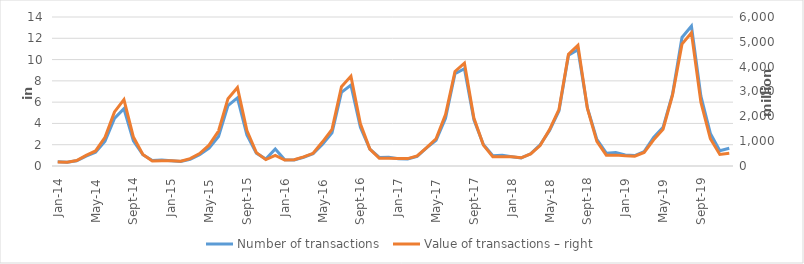
| Category | Number of transactions  |
|---|---|
| sij.14 | 397343 |
| vlj.14 | 361078 |
| ožu.14 | 493145 |
| tra.14 | 934003 |
| svi.14 | 1295388 |
| lip.14 | 2322493 |
| srp.14 | 4472930 |
| kol.14 | 5380145 |
| ruj.14 | 2354410 |
| lis.14 | 1061057 |
| stu.14 | 515074 |
| pro.14 | 552008 |
| sij.15 | 487873 |
| vlj.15 | 434472 |
| ožu.15 | 618192 |
| tra.15 | 1071368 |
| svi.15 | 1684681 |
| lip.15 | 2777989 |
| srp.15 | 5680159 |
| kol.15 | 6394748 |
| ruj.15 | 2918051 |
| lis.15 | 1209535 |
| stu.15 | 648645 |
| pro.15 | 1601674 |
| sij.16 | 584292 |
| vlj.16 | 574917 |
| ožu.16 | 823749 |
| tra.16 | 1149524 |
| svi.16 | 2038066 |
| lip.16 | 3106484 |
| srp.16 | 6928007 |
| kol.16 | 7595443 |
| ruj.16 | 3649461 |
| lis.16 | 1590986 |
| stu.16 | 802784 |
| pro.16 | 832600 |
| sij.17 | 684062 |
| vlj.17 | 667841 |
| ožu.17 | 903419 |
| tra.17 | 1701419 |
| svi.17 | 2408336 |
| lip.17 | 4486057 |
| srp.17 | 8663549 |
| kol.17 | 9142665 |
| ruj.17 | 4345036 |
| lis.17 | 2028244 |
| stu.17 | 958090 |
| pro.17 | 1004475 |
| sij.18 | 877554 |
| Feb- 18 | 761371 |
| ožu.18 | 1143138 |
| tra.18 | 1996709 |
| svi.18 | 3328942 |
| lip.18 | 5198448 |
| srp.18 | 10409271 |
| kol.18 | 10932790 |
| ruj.18 | 5457745 |
| lis.18 | 2502920 |
| stu.18 | 1207090 |
| pro.18 | 1267869 |
| sij.19 | 1030317 |
| Feb- 19 | 978277 |
| ožu.19 | 1348516 |
| tra.19 | 2678504 |
| svi.19 | 3636139 |
| lip.19 | 6740954 |
| srp.19 | 12076123 |
| kol.19 | 13149487 |
| ruj.19 | 6567510 |
| lis.19 | 3056294 |
| stu.19 | 1430865 |
| pro.19 | 1661546 |